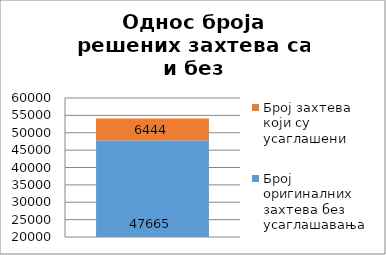
| Category | Број оригиналних захтева без усаглашавања | Број захтева који су усаглашени |
|---|---|---|
| 0 | 47665 | 6444 |